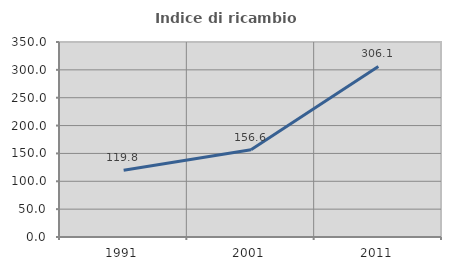
| Category | Indice di ricambio occupazionale  |
|---|---|
| 1991.0 | 119.816 |
| 2001.0 | 156.604 |
| 2011.0 | 306.122 |